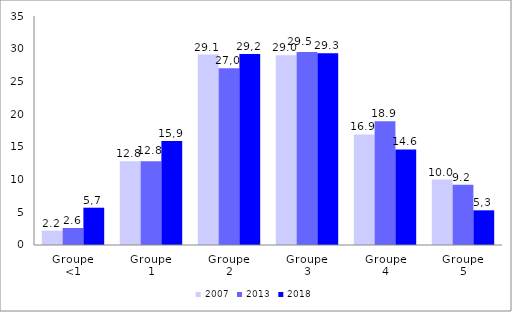
| Category | 2007 | 2013 | 2018 |
|---|---|---|---|
| Groupe 
<1 | 2.2 | 2.6 | 5.7 |
| Groupe 
1 | 12.8 | 12.8 | 15.9 |
| Groupe 
2 | 29.1 | 27 | 29.2 |
| Groupe 
3 | 29 | 29.5 | 29.3 |
| Groupe
4 | 16.9 | 18.9 | 14.6 |
| Groupe 
5 | 10 | 9.2 | 5.3 |